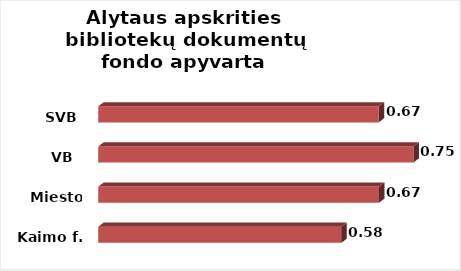
| Category | Series 0 |
|---|---|
| Kaimo f. | 0.58 |
| Miesto f. | 0.67 |
| VB  | 0.752 |
| SVB | 0.669 |